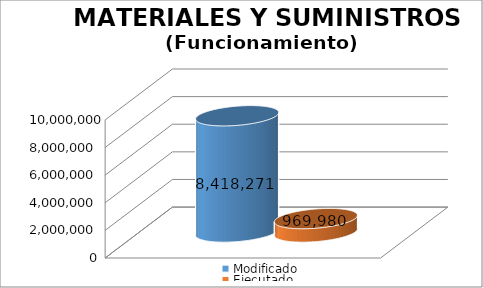
| Category | Modificado | Ejecutado |
|---|---|---|
| 0 | 8418271 | 969980.01 |